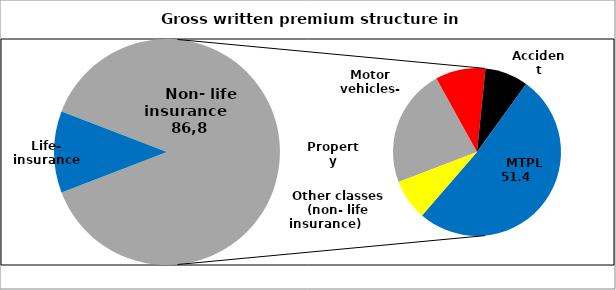
| Category | Series 0 |
|---|---|
| 0 | 13.204 |
| 1 | 22.8 |
| 2 | 9.642 |
| 3 | 8.333 |
| 4 | 51.37 |
| 5 | 7.815 |